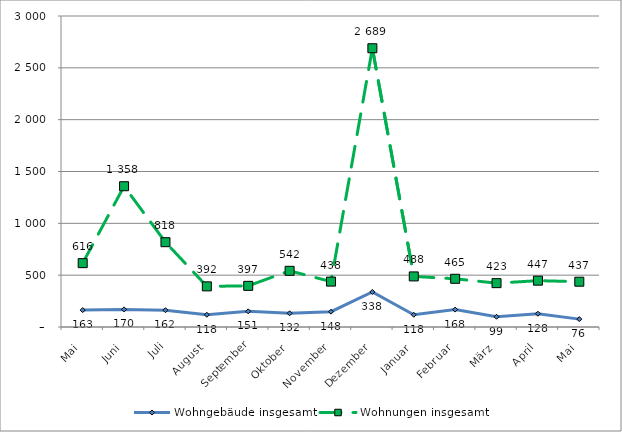
| Category | Wohngebäude insgesamt | Wohnungen insgesamt |
|---|---|---|
| Mai | 163 | 616 |
| Juni | 170 | 1358 |
| Juli | 162 | 818 |
| August | 118 | 392 |
| September | 151 | 397 |
| Oktober | 132 | 542 |
| November | 148 | 438 |
| Dezember | 338 | 2689 |
| Januar | 118 | 488 |
| Februar | 168 | 465 |
| März | 99 | 423 |
| April | 128 | 447 |
| Mai | 76 | 437 |